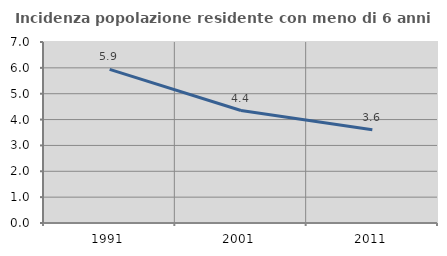
| Category | Incidenza popolazione residente con meno di 6 anni |
|---|---|
| 1991.0 | 5.94 |
| 2001.0 | 4.35 |
| 2011.0 | 3.605 |